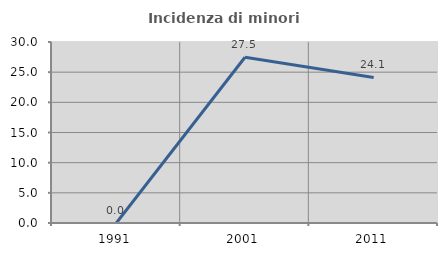
| Category | Incidenza di minori stranieri |
|---|---|
| 1991.0 | 0 |
| 2001.0 | 27.473 |
| 2011.0 | 24.123 |